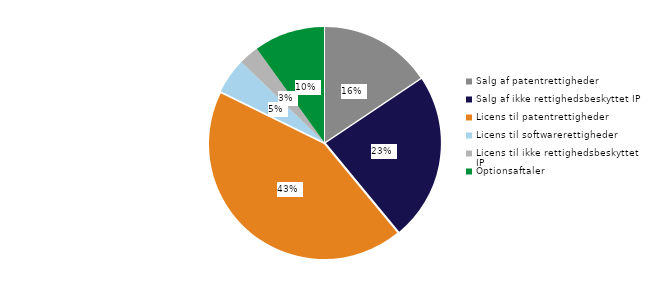
| Category | Series 0 |
|---|---|
| Salg af patentrettigheder | 0.156 |
| Salg af softwarerettigheder | 0 |
| Salg af ikke rettighedsbeskyttet IP | 0.234 |
| Licens til patentrettigheder | 0.433 |
| Licens til softwarerettigheder | 0.05 |
| Licens til ikke rettighedsbeskyttet IP | 0.028 |
| Optionsaftaler | 0.099 |